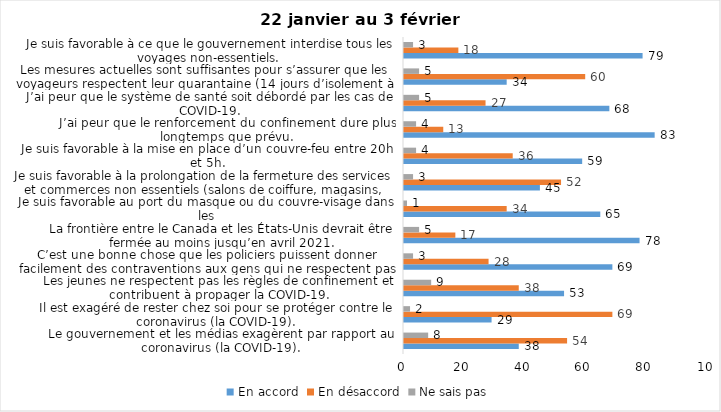
| Category | En accord | En désaccord | Ne sais pas |
|---|---|---|---|
| Le gouvernement et les médias exagèrent par rapport au coronavirus (la COVID-19). | 38 | 54 | 8 |
| Il est exagéré de rester chez soi pour se protéger contre le coronavirus (la COVID-19). | 29 | 69 | 2 |
| Les jeunes ne respectent pas les règles de confinement et contribuent à propager la COVID-19. | 53 | 38 | 9 |
| C’est une bonne chose que les policiers puissent donner facilement des contraventions aux gens qui ne respectent pas les mesures pour prévenir le coronavirus (la COVID-19). | 69 | 28 | 3 |
| La frontière entre le Canada et les États-Unis devrait être fermée au moins jusqu’en avril 2021. | 78 | 17 | 5 |
| Je suis favorable au port du masque ou du couvre-visage dans les
lieux publics extérieurs achalandés (ex. rues, parcs) | 65 | 34 | 1 |
| Je suis favorable à la prolongation de la fermeture des services et commerces non essentiels (salons de coiffure, magasins, industries) jusqu’au 8 février. | 45 | 52 | 3 |
| Je suis favorable à la mise en place d’un couvre-feu entre 20h et 5h. | 59 | 36 | 4 |
| J’ai peur que le renforcement du confinement dure plus longtemps que prévu. | 83 | 13 | 4 |
| J’ai peur que le système de santé soit débordé par les cas de COVID-19. | 68 | 27 | 5 |
| Les mesures actuelles sont suffisantes pour s’assurer que les voyageurs respectent leur quarantaine (14 jours d’isolement à la maison au retour d’un voyage). | 34 | 60 | 5 |
| Je suis favorable à ce que le gouvernement interdise tous les voyages non-essentiels. | 79 | 18 | 3 |